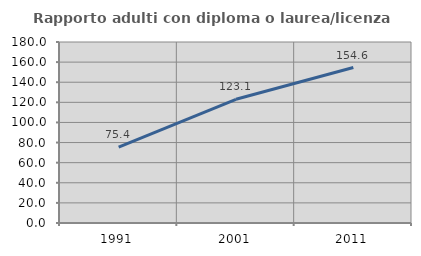
| Category | Rapporto adulti con diploma o laurea/licenza media  |
|---|---|
| 1991.0 | 75.362 |
| 2001.0 | 123.051 |
| 2011.0 | 154.576 |